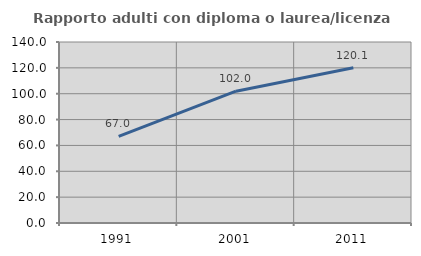
| Category | Rapporto adulti con diploma o laurea/licenza media  |
|---|---|
| 1991.0 | 66.975 |
| 2001.0 | 101.978 |
| 2011.0 | 120.084 |